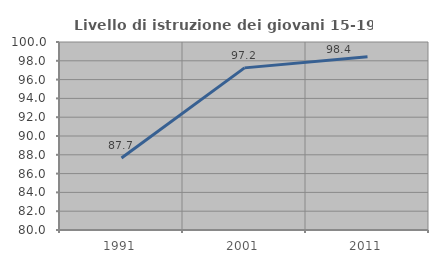
| Category | Livello di istruzione dei giovani 15-19 anni |
|---|---|
| 1991.0 | 87.654 |
| 2001.0 | 97.248 |
| 2011.0 | 98.421 |